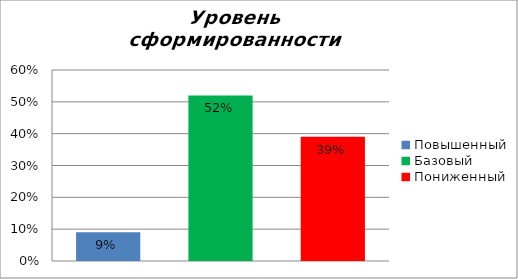
| Category | Уровень сформированности предметных результатов |
|---|---|
| Повышенный | 0.09 |
| Базовый | 0.52 |
| Пониженный | 0.39 |